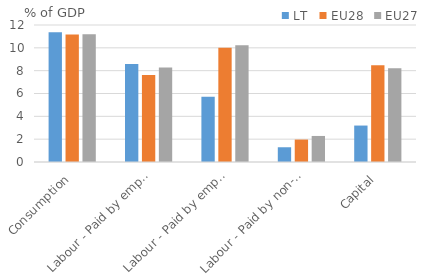
| Category | LT | EU28 | EU27 |
|---|---|---|---|
| Consumption | 11.375 | 11.162 | 11.186 |
| Labour - Paid by employers | 8.587 | 7.618 | 8.281 |
| Labour - Paid by employees | 5.721 | 9.997 | 10.231 |
| Labour - Paid by non-employed | 1.291 | 1.966 | 2.281 |
| Capital | 3.192 | 8.473 | 8.218 |